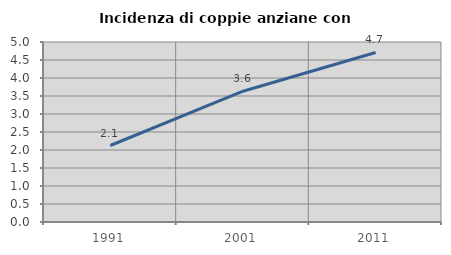
| Category | Incidenza di coppie anziane con figli |
|---|---|
| 1991.0 | 2.125 |
| 2001.0 | 3.634 |
| 2011.0 | 4.709 |